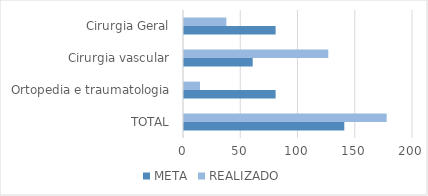
| Category | META | REALIZADO |
|---|---|---|
| TOTAL | 140 | 177 |
| Ortopedia e traumatologia | 80 | 14 |
| Cirurgia vascular | 60 | 126 |
| Cirurgia Geral | 80 | 37 |